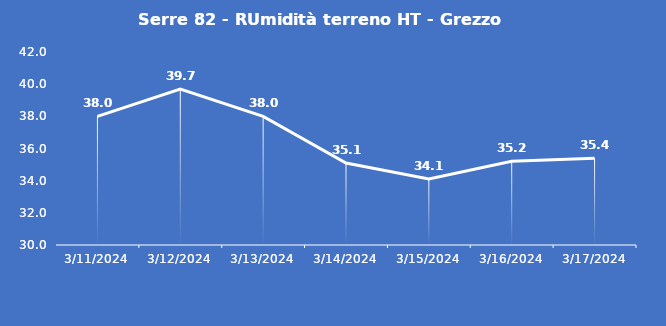
| Category | Serre 82 - RUmidità terreno HT - Grezzo (%VWC) |
|---|---|
| 3/11/24 | 38 |
| 3/12/24 | 39.7 |
| 3/13/24 | 38 |
| 3/14/24 | 35.1 |
| 3/15/24 | 34.1 |
| 3/16/24 | 35.2 |
| 3/17/24 | 35.4 |